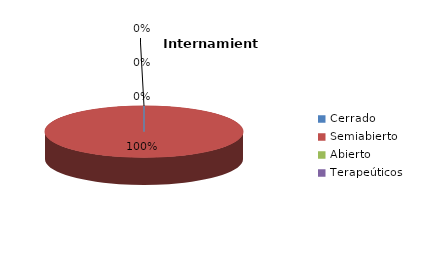
| Category | Series 0 |
|---|---|
| Cerrado | 0 |
| Semiabierto | 6 |
| Abierto | 0 |
| Terapeúticos | 0 |